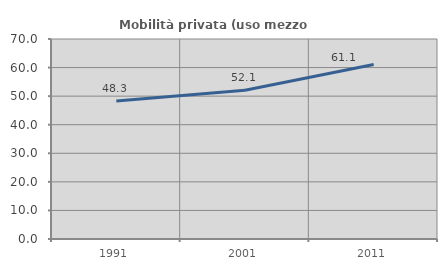
| Category | Mobilità privata (uso mezzo privato) |
|---|---|
| 1991.0 | 48.266 |
| 2001.0 | 52.068 |
| 2011.0 | 61.071 |